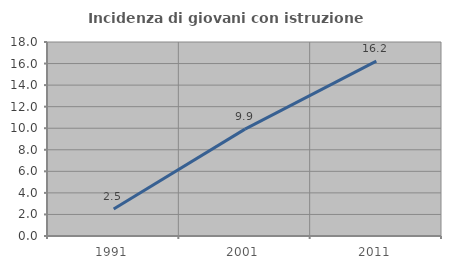
| Category | Incidenza di giovani con istruzione universitaria |
|---|---|
| 1991.0 | 2.497 |
| 2001.0 | 9.916 |
| 2011.0 | 16.222 |